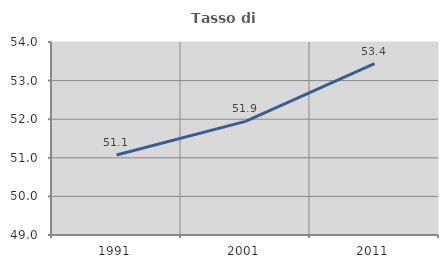
| Category | Tasso di occupazione   |
|---|---|
| 1991.0 | 51.073 |
| 2001.0 | 51.942 |
| 2011.0 | 53.44 |